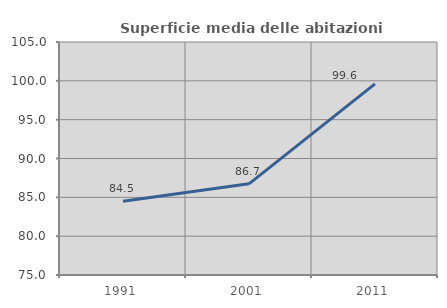
| Category | Superficie media delle abitazioni occupate |
|---|---|
| 1991.0 | 84.494 |
| 2001.0 | 86.738 |
| 2011.0 | 99.599 |